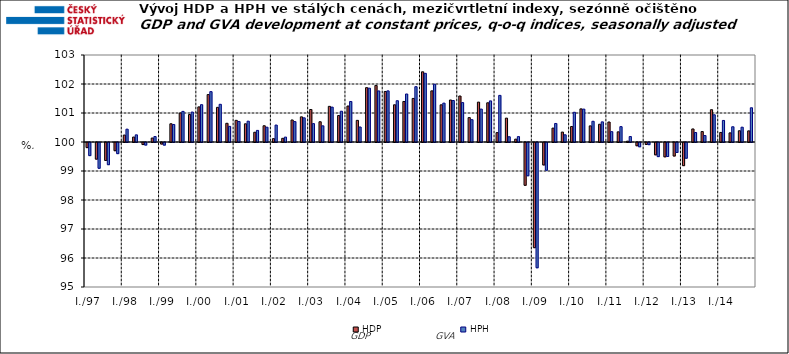
| Category | HDP

 | HPH

 |
|---|---|---|
| I./97 | 99.824 | 99.548 |
|  | 99.426 | 99.111 |
|  | 99.381 | 99.235 |
|  | 99.717 | 99.616 |
| I./98 | 100.239 | 100.443 |
|  | 100.171 | 100.246 |
|  | 99.929 | 99.911 |
|  | 100.137 | 100.188 |
| I./99 | 99.947 | 99.91 |
|  | 100.628 | 100.604 |
|  | 100.999 | 101.055 |
|  | 100.948 | 101.033 |
| I./00 | 101.211 | 101.287 |
|  | 101.635 | 101.737 |
|  | 101.195 | 101.3 |
|  | 100.645 | 100.54 |
| I./01 | 100.746 | 100.708 |
|  | 100.628 | 100.718 |
|  | 100.336 | 100.4 |
|  | 100.56 | 100.51 |
| I./02 | 100.116 | 100.584 |
|  | 100.127 | 100.169 |
|  | 100.76 | 100.704 |
|  | 100.867 | 100.833 |
| I./03 | 101.121 | 100.633 |
|  | 100.698 | 100.558 |
|  | 101.229 | 101.203 |
|  | 100.913 | 101.061 |
| I./04 | 101.241 | 101.397 |
|  | 100.747 | 100.518 |
|  | 101.874 | 101.856 |
|  | 101.951 | 101.761 |
| I./05 | 101.743 | 101.763 |
|  | 101.283 | 101.424 |
|  | 101.397 | 101.656 |
|  | 101.502 | 101.907 |
| I./06 | 102.421 | 102.368 |
|  | 101.763 | 101.992 |
|  | 101.282 | 101.34 |
|  | 101.448 | 101.431 |
| I./07 | 101.586 | 101.359 |
|  | 100.841 | 100.77 |
|  | 101.375 | 101.135 |
|  | 101.352 | 101.417 |
| I./08 | 100.323 | 101.608 |
|  | 100.823 | 100.181 |
|  | 100.099 | 100.185 |
|  | 98.525 | 98.853 |
| I./09 | 96.373 | 95.68 |
|  | 99.226 | 99.043 |
|  | 100.479 | 100.639 |
|  | 100.343 | 100.248 |
| I./10 | 100.535 | 101.025 |
|  | 101.142 | 101.135 |
|  | 100.556 | 100.715 |
|  | 100.612 | 100.694 |
| I./11 | 100.69 | 100.357 |
|  | 100.351 | 100.53 |
|  | 100.029 | 100.188 |
|  | 99.888 | 99.853 |
| I./12 | 99.932 | 99.926 |
|  | 99.574 | 99.513 |
|  | 99.506 | 99.516 |
|  | 99.534 | 99.656 |
| I./13 | 99.202 | 99.458 |
|  | 100.45 | 100.327 |
|  | 100.36 | 100.223 |
|  | 101.113 | 100.939 |
| I./14 | 100.33 | 100.743 |